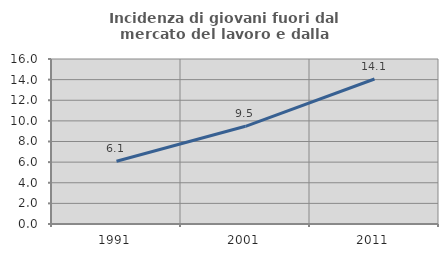
| Category | Incidenza di giovani fuori dal mercato del lavoro e dalla formazione  |
|---|---|
| 1991.0 | 6.087 |
| 2001.0 | 9.474 |
| 2011.0 | 14.062 |